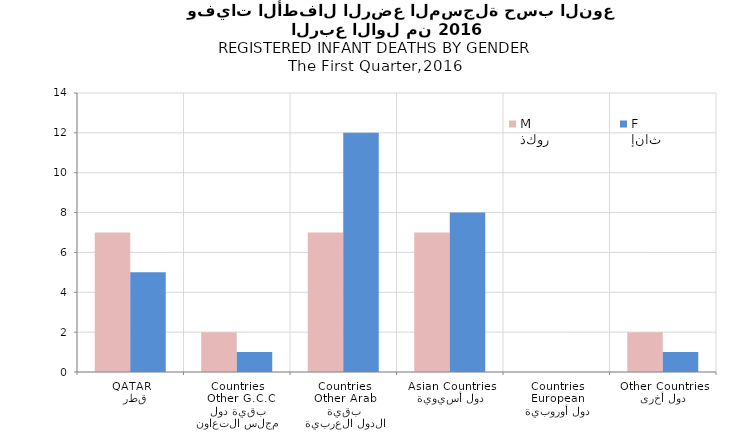
| Category | ذكور
M | إناث
F |
|---|---|---|
|   قطر
QATAR | 7 | 5 |
| بقية دول مجلس التعاون
 Other G.C.C Countries | 2 | 1 |
| بقية الدول العربية
Other Arab Countries | 7 | 12 |
| دول أسيوية
Asian Countries | 7 | 8 |
| دول أوروبية
European Countries | 0 | 0 |
| دول أخرى
Other Countries | 2 | 1 |